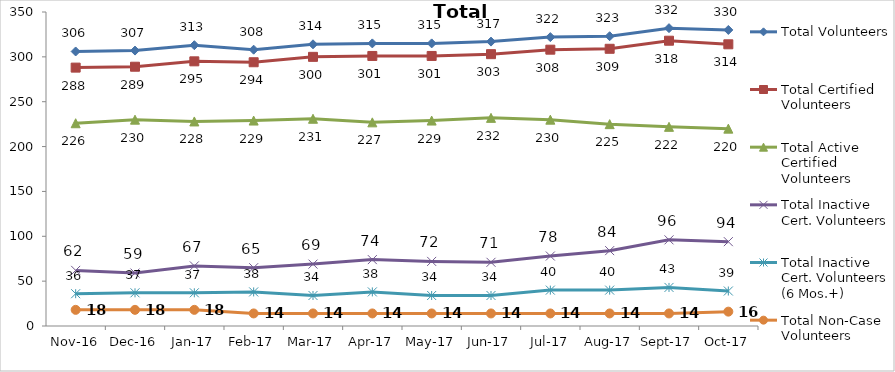
| Category | Total Volunteers | Total Certified Volunteers | Total Active Certified Volunteers | Total Inactive Cert. Volunteers | Total Inactive Cert. Volunteers (6 Mos.+) | Total Non-Case Volunteers |
|---|---|---|---|---|---|---|
| 2016-11-01 | 306 | 288 | 226 | 62 | 36 | 18 |
| 2016-12-01 | 307 | 289 | 230 | 59 | 37 | 18 |
| 2017-01-01 | 313 | 295 | 228 | 67 | 37 | 18 |
| 2017-02-01 | 308 | 294 | 229 | 65 | 38 | 14 |
| 2017-03-01 | 314 | 300 | 231 | 69 | 34 | 14 |
| 2017-04-01 | 315 | 301 | 227 | 74 | 38 | 14 |
| 2017-05-01 | 315 | 301 | 229 | 72 | 34 | 14 |
| 2017-06-01 | 317 | 303 | 232 | 71 | 34 | 14 |
| 2017-07-01 | 322 | 308 | 230 | 78 | 40 | 14 |
| 2017-08-01 | 323 | 309 | 225 | 84 | 40 | 14 |
| 2017-09-01 | 332 | 318 | 222 | 96 | 43 | 14 |
| 2017-10-01 | 330 | 314 | 220 | 94 | 39 | 16 |